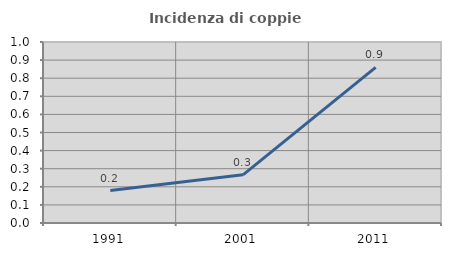
| Category | Incidenza di coppie miste |
|---|---|
| 1991.0 | 0.179 |
| 2001.0 | 0.266 |
| 2011.0 | 0.86 |